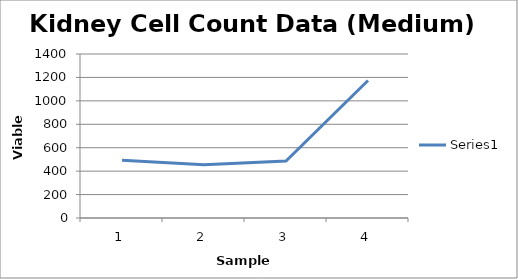
| Category | Series 0 |
|---|---|
| 0 | 492 |
| 1 | 454 |
| 2 | 486 |
| 3 | 1174 |